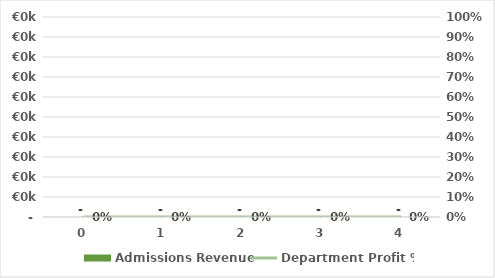
| Category | Admissions Revenue |
|---|---|
| 0.0 | 0 |
| 1.0 | 0 |
| 2.0 | 0 |
| 3.0 | 0 |
| 4.0 | 0 |